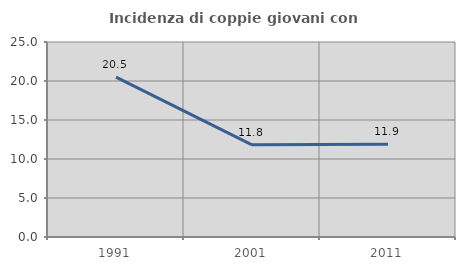
| Category | Incidenza di coppie giovani con figli |
|---|---|
| 1991.0 | 20.488 |
| 2001.0 | 11.818 |
| 2011.0 | 11.885 |